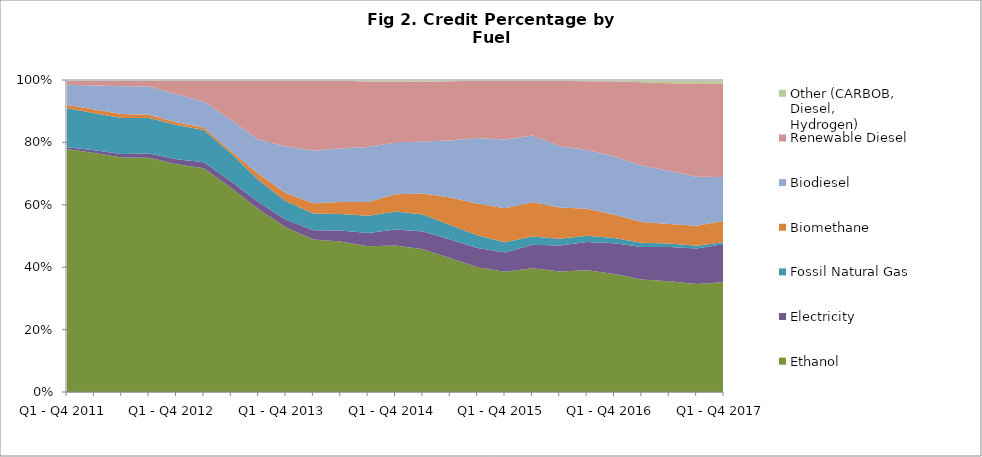
| Category | Ethanol | Electricity | Fossil Natural Gas | Biomethane | Biodiesel | Renewable Diesel | Other (CARBOB, Diesel,
Hydrogen) |
|---|---|---|---|---|---|---|---|
| Q1 - Q4 2011 | 255887 | 1936 | 41098 | 3679 | 21067 | 4255 | 754 |
| Q2 2011-Q1 2012 | 266726 | 2951 | 41170 | 4218 | 26837 | 5163 | 984 |
| Q3 2011 - Q2 2012 | 269744 | 4018 | 41418 | 4506 | 31928 | 6022 | 1285 |
| Q4 2011 - Q3 2012 | 288811 | 5227 | 43542 | 4160 | 34835 | 6916 | 980 |
| Q1 - Q4 2012 | 304774 | 6746 | 45792 | 3711 | 37337 | 18165 | 956 |
| Q2 2012 - Q1 2013 | 351043 | 9379 | 50548 | 3680 | 40338 | 32601 | 1651 |
| Q3 2012 - Q2 2013 | 394796 | 12868 | 54271 | 3919 | 60626 | 75473 | 2051 |
| Q4 2012 - Q3 2013 | 451908 | 17304 | 54494 | 15304 | 84732 | 145738 | 2222 |
| Q1 - Q4 2013 | 495970 | 23488 | 55487 | 24517 | 141668 | 197482 | 2322 |
| Q2 2013 -Q1 2014 | 499194 | 30164 | 55102 | 33883 | 172126 | 229473 | 1656 |
| Q3 2013 - Q2 2014 | 527117 | 38058 | 58197 | 42046 | 187184 | 237650 | 2306 |
| Q4 2013 - Q3 2014 | 512500 | 46640 | 60710 | 47888 | 193299 | 230532 | 5110 |
| Q1 - Q4 2014 | 507721 | 55332 | 61841 | 59812 | 179500 | 211245 | 4998 |
| Q2 2014 -Q1 2015 | 511213 | 63321 | 61021 | 74716 | 186099 | 214231 | 5874 |
| Q3 2014 -Q2 2015 | 499516 | 70066 | 54408 | 102904 | 212266 | 221522 | 4836 |
| Q4 2014 - Q3 2015 | 502037 | 77984 | 49846 | 127871 | 264657 | 231039 | 2919 |
| Q1 - Q4 2015 | 531188 | 84435 | 45377 | 150052 | 303478 | 259543 | 3334 |
| Q2 2015 - Q1 2016 | 621973 | 117894 | 41742 | 172380 | 335226 | 277097 | 2439 |
| Q3 2015 - Q2 2016 | 710130 | 152674 | 41127 | 183954 | 361312 | 384695 | 5040 |
| Q4 2015 - Q3 2016 | 805437 | 186586 | 40468 | 179614 | 387917 | 454444 | 8490 |
| Q1 - Q4 2016 | 879921 | 227452 | 39805 | 173348 | 434196 | 560304 | 9473 |
| Q2 2016 - Q1 2017 | 866507 | 248720 | 33842 | 159850 | 431250 | 644325 | 16480 |
| Q3 2016 - Q2 2017 | 866452 | 268416 | 27047 | 153979 | 415146 | 685592 | 25619 |
| Q4 2016 - Q3 2017 | 869414 | 287591 | 20635 | 161522 | 395789 | 752235 | 26310 |
| Q1 - Q4 2017 | 871968 | 304010 | 14830 | 170200 | 348042 | 741682 | 28075 |